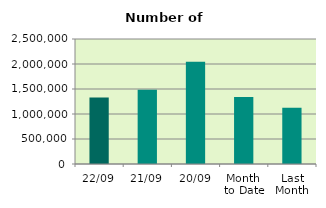
| Category | Series 0 |
|---|---|
| 22/09 | 1329196 |
| 21/09 | 1485876 |
| 20/09 | 2043886 |
| Month 
to Date | 1340433.875 |
| Last
Month | 1124493.364 |